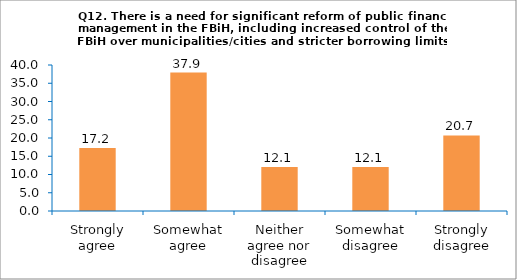
| Category | Series 0 |
|---|---|
| Strongly agree | 17.241 |
| Somewhat agree | 37.931 |
| Neither agree nor disagree | 12.069 |
| Somewhat disagree | 12.069 |
| Strongly disagree | 20.69 |